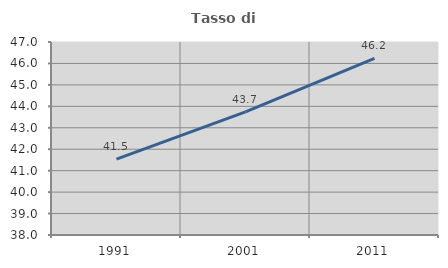
| Category | Tasso di occupazione   |
|---|---|
| 1991.0 | 41.539 |
| 2001.0 | 43.739 |
| 2011.0 | 46.242 |